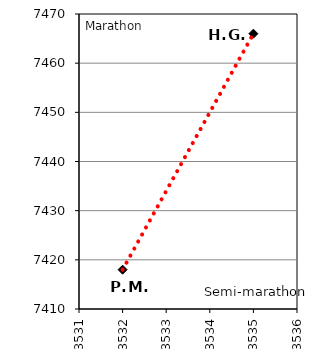
| Category | Series 0 |
|---|---|
| 3532.0 | 7418 |
| 3535.0 | 7466 |